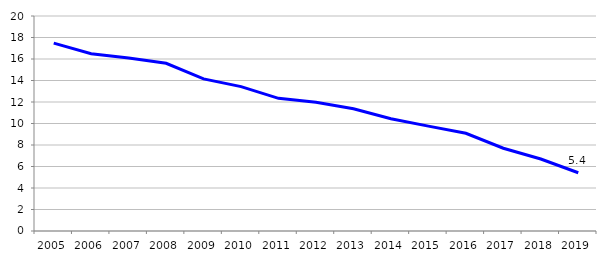
| Category | Total en retard |
|---|---|
| 2005 | 17.473 |
| 2006 | 16.488 |
| 2007 | 16.084 |
| 2008 | 15.601 |
| 2009 | 14.153 |
| 2010 | 13.43 |
| 2011 | 12.341 |
| 2012 | 11.973 |
| 2013 | 11.371 |
| 2014 | 10.448 |
| 2015 | 9.754 |
| 2016 | 9.088 |
| 2017 | 7.697 |
| 2018 | 6.696 |
| 2019 | 5.418 |